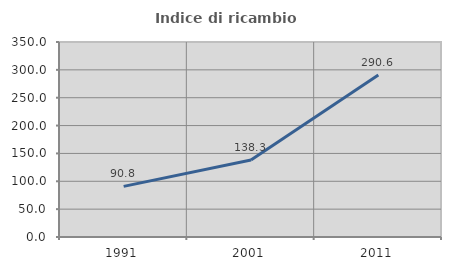
| Category | Indice di ricambio occupazionale  |
|---|---|
| 1991.0 | 90.816 |
| 2001.0 | 138.333 |
| 2011.0 | 290.566 |